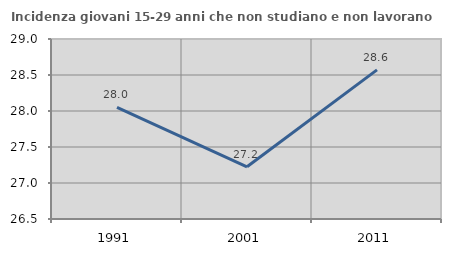
| Category | Incidenza giovani 15-29 anni che non studiano e non lavorano  |
|---|---|
| 1991.0 | 28.049 |
| 2001.0 | 27.225 |
| 2011.0 | 28.571 |